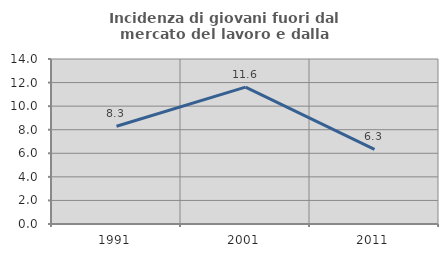
| Category | Incidenza di giovani fuori dal mercato del lavoro e dalla formazione  |
|---|---|
| 1991.0 | 8.29 |
| 2001.0 | 11.613 |
| 2011.0 | 6.338 |